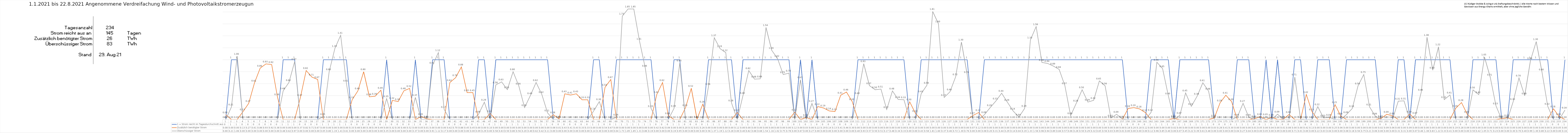
| Category | 1 = Strom reicht im Tagesdurchschnitt aus | Zusätzlich benötigter Strom | Überschüssiger Strom |
|---|---|---|---|
| 0 | 0 | 0.08 | 0 |
| 1 | 1 | 0 | 0.21 |
| 2 | 1 | 0 | 1.06 |
| 3 | 0 | 0.13 | 0 |
| 4 | 0 | 0.27 | 0 |
| 5 | 0 | 0.61 | 0 |
| 6 | 0 | 0.86 | 0 |
| 7 | 0 | 0.93 | 0 |
| 8 | 0 | 0.92 | 0 |
| 9 | 0 | 0.38 | 0 |
| 10 | 1 | 0 | 0.48 |
| 11 | 1 | 0 | 0.62 |
| 12 | 1 | 0 | 0.97 |
| 13 | 0 | 0.37 | 0 |
| 14 | 0 | 0.82 | 0 |
| 15 | 0 | 0.71 | 0 |
| 16 | 0 | 0.67 | 0 |
| 17 | 1 | 0 | 0.05 |
| 18 | 1 | 0 | 0.8 |
| 19 | 1 | 0 | 1.19 |
| 20 | 1 | 0 | 1.41 |
| 21 | 1 | 0 | 0.61 |
| 22 | 0 | 0.33 | 0 |
| 23 | 0 | 0.48 | 0 |
| 24 | 0 | 0.8 | 0 |
| 25 | 0 | 0.38 | 0 |
| 26 | 0 | 0.39 | 0 |
| 27 | 0 | 0.49 | 0 |
| 28 | 1 | 0 | 0.35 |
| 29 | 0 | 0.32 | 0 |
| 30 | 0 | 0.3 | 0 |
| 31 | 0 | 0.48 | 0 |
| 32 | 0 | 0.52 | 0 |
| 33 | 1 | 0 | 0.37 |
| 34 | 0 | 0.05 | 0 |
| 35 | 0 | 0.01 | 0 |
| 36 | 1 | 0 | 0.91 |
| 37 | 1 | 0 | 1.12 |
| 38 | 1 | 0 | 0.17 |
| 39 | 0 | 0.62 | 0 |
| 40 | 0 | 0.7 | 0 |
| 41 | 0 | 0.88 | 0 |
| 42 | 0 | 0.45 | 0 |
| 43 | 0 | 0.45 | 0 |
| 44 | 1 | 0 | 0.09 |
| 45 | 1 | 0 | 0.29 |
| 46 | 0 | 0.1 | 0 |
| 47 | 1 | 0 | 0.58 |
| 48 | 1 | 0 | 0.63 |
| 49 | 1 | 0 | 0.5 |
| 50 | 1 | 0 | 0.8 |
| 51 | 1 | 0 | 0.56 |
| 52 | 1 | 0 | 0.2 |
| 53 | 1 | 0 | 0.4 |
| 54 | 1 | 0 | 0.62 |
| 55 | 1 | 0 | 0.42 |
| 56 | 1 | 0 | 0.11 |
| 57 | 0 | 0.08 | 0 |
| 58 | 0 | 0.01 | 0 |
| 59 | 0 | 0.43 | 0 |
| 60 | 0 | 0.41 | 0 |
| 61 | 0 | 0.43 | 0 |
| 62 | 0 | 0.33 | 0 |
| 63 | 0 | 0.33 | 0 |
| 64 | 1 | 0 | 0.14 |
| 65 | 1 | 0 | 0.3 |
| 66 | 0 | 0.54 | 0 |
| 67 | 0 | 0.67 | 0 |
| 68 | 1 | 0 | 0.04 |
| 69 | 1 | 0 | 1.73 |
| 70 | 1 | 0 | 1.85 |
| 71 | 1 | 0 | 1.85 |
| 72 | 1 | 0 | 1.31 |
| 73 | 1 | 0 | 0.861 |
| 74 | 1 | 0 | 0.185 |
| 75 | 0 | 0.42 | 0 |
| 76 | 0 | 0.619 | 0 |
| 77 | 0 | 0.064 | 0 |
| 78 | 1 | 0 | 0.187 |
| 79 | 1 | 0 | 0.946 |
| 80 | 0 | 0.198 | 0 |
| 81 | 0 | 0.523 | 0 |
| 82 | 0 | 0.007 | 0 |
| 83 | 0 | 0.257 | 0 |
| 84 | 1 | 0 | 0.555 |
| 85 | 1 | 0 | 1.369 |
| 86 | 1 | 0 | 1.186 |
| 87 | 1 | 0 | 1.12 |
| 88 | 1 | 0 | 0.278 |
| 89 | 0 | 0.117 | 0 |
| 90 | 1 | 0 | 0.403 |
| 91 | 1 | 0 | 0.819 |
| 92 | 1 | 0 | 0.676 |
| 93 | 1 | 0 | 0.681 |
| 94 | 1 | 0 | 1.541 |
| 95 | 1 | 0 | 1.158 |
| 96 | 1 | 0 | 1.022 |
| 97 | 1 | 0 | 0.752 |
| 98 | 1 | 0 | 0.776 |
| 99 | 0 | 0.123 | 0 |
| 100 | 1 | 0 | 0.665 |
| 101 | 0 | 0.034 | 0 |
| 102 | 1 | 0 | 0.269 |
| 103 | 0 | 0.218 | 0 |
| 104 | 0 | 0.193 | 0 |
| 105 | 0 | 0.144 | 0 |
| 106 | 0 | 0.133 | 0 |
| 107 | 0 | 0.407 | 0 |
| 108 | 0 | 0.46 | 0 |
| 109 | 0 | 0.3 | 0 |
| 110 | 1 | 0 | 0.402 |
| 111 | 1 | 0 | 0.934 |
| 112 | 1 | 0 | 0.567 |
| 113 | 1 | 0 | 0.498 |
| 114 | 1 | 0 | 0.509 |
| 115 | 1 | 0 | 0.167 |
| 116 | 1 | 0 | 0.478 |
| 117 | 1 | 0 | 0.336 |
| 118 | 1 | 0 | 0.331 |
| 119 | 0 | 0.296 | 0 |
| 120 | 0 | 0.103 | 0 |
| 121 | 1 | 0 | 0.432 |
| 122 | 1 | 0 | 0.575 |
| 123 | 1 | 0 | 1.808 |
| 124 | 1 | 0 | 1.602 |
| 125 | 1 | 0 | 0.369 |
| 126 | 1 | 0 | 0.463 |
| 127 | 1 | 0 | 0.716 |
| 128 | 1 | 0 | 1.296 |
| 129 | 1 | 0 | 0.755 |
| 130 | 0 | 0.067 | 0 |
| 131 | 0 | 0.117 | 0 |
| 132 | 1 | 0 | 0.081 |
| 133 | 1 | 0 | 0.2 |
| 134 | 1 | 0 | 0.31 |
| 135 | 1 | 0 | 0.44 |
| 136 | 1 | 0 | 0.289 |
| 137 | 1 | 0 | 0.142 |
| 138 | 1 | 0 | 0.041 |
| 139 | 1 | 0 | 0.186 |
| 140 | 1 | 0 | 1.332 |
| 141 | 1 | 0 | 1.555 |
| 142 | 1 | 0 | 0.955 |
| 143 | 1 | 0 | 0.938 |
| 144 | 1 | 0 | 0.894 |
| 145 | 1 | 0 | 0.838 |
| 146 | 1 | 0 | 0.567 |
| 147 | 1 | 0 | 0.064 |
| 148 | 1 | 0 | 0.276 |
| 149 | 1 | 0 | 0.498 |
| 150 | 1 | 0 | 0.292 |
| 151 | 1 | 0 | 0.321 |
| 152 | 1 | 0 | 0.646 |
| 153 | 1 | 0 | 0.563 |
| 154 | 1 | 0 | 0.026 |
| 155 | 1 | 0 | 0.087 |
| 156 | 1 | 0 | 0.009 |
| 157 | 0 | 0.184 | 0 |
| 158 | 0 | 0.199 | 0 |
| 159 | 0 | 0.177 | 0 |
| 160 | 0 | 0.116 | 0 |
| 161 | 1 | 0 | 0.12 |
| 162 | 1 | 0 | 0.959 |
| 163 | 1 | 0 | 0.851 |
| 164 | 1 | 0 | 0.397 |
| 165 | 0 | 0.017 | 0 |
| 166 | 1 | 0 | 0.069 |
| 167 | 1 | 0 | 0.445 |
| 168 | 1 | 0 | 0.221 |
| 169 | 1 | 0 | 0.389 |
| 170 | 1 | 0 | 0.615 |
| 171 | 1 | 0 | 0.476 |
| 172 | 0 | 0.027 | 0 |
| 173 | 0 | 0.28 | 0 |
| 174 | 0 | 0.406 | 0 |
| 175 | 0 | 0.3 | 0 |
| 176 | 1 | 0 | 0.042 |
| 177 | 1 | 0 | 0.271 |
| 178 | 1 | 0 | 0.038 |
| 179 | 0 | 0.014 | 0 |
| 180 | 0 | 0.049 | 0 |
| 181 | 1 | 0 | 0.046 |
| 182 | 0 | 0.038 | 0 |
| 183 | 1 | 0 | 0.09 |
| 184 | 0 | 0.005 | 0 |
| 185 | 0 | 0.084 | 0 |
| 186 | 1 | 0 | 0.711 |
| 187 | 1 | 0 | 0.006 |
| 188 | 0 | 0.419 | 0 |
| 189 | 0 | 0.129 | 0 |
| 190 | 1 | 0 | 0.215 |
| 191 | 1 | 0 | 0.026 |
| 192 | 1 | 0 | 0.038 |
| 193 | 0 | 0.249 | 0 |
| 194 | 0 | 0.057 | 0 |
| 195 | 1 | 0 | 0.084 |
| 196 | 1 | 0 | 0.185 |
| 197 | 1 | 0 | 0.563 |
| 198 | 1 | 0 | 0.753 |
| 199 | 1 | 0 | 0.212 |
| 200 | 1 | 0 | 0.058 |
| 201 | 0 | 0.018 | 0 |
| 202 | 0 | 0.087 | 0 |
| 203 | 0 | 0.063 | 0 |
| 204 | 1 | 0 | 0.307 |
| 205 | 1 | 0 | 0.312 |
| 206 | 0 | 0.092 | 0 |
| 207 | 1 | 0 | 0.071 |
| 208 | 1 | 0 | 0.458 |
| 209 | 1 | 0 | 1.377 |
| 210 | 1 | 0 | 0.826 |
| 211 | 1 | 0 | 1.216 |
| 212 | 1 | 0 | 0.333 |
| 213 | 1 | 0 | 0.411 |
| 214 | 0 | 0.189 | 0 |
| 215 | 0 | 0.284 | 0 |
| 216 | 0 | 0.088 | 0 |
| 217 | 1 | 0 | 0.496 |
| 218 | 1 | 0 | 0.417 |
| 219 | 1 | 0 | 1.046 |
| 220 | 1 | 0 | 0.708 |
| 221 | 1 | 0 | 0.229 |
| 222 | 0 | 0.015 | 0 |
| 223 | 0 | 0.029 | 0 |
| 224 | 1 | 0 | 0.301 |
| 225 | 1 | 0 | 0.696 |
| 226 | 1 | 0 | 0.397 |
| 227 | 1 | 0 | 0.987 |
| 228 | 1 | 0 | 1.305 |
| 229 | 1 | 0 | 0.797 |
| 230 | 1 | 0 | 0.223 |
| 231 | 0 | 0.18 | 0 |
| 232 | 0 | 0.049 | 0 |
| 233 | 1 | 0 | 0.158 |